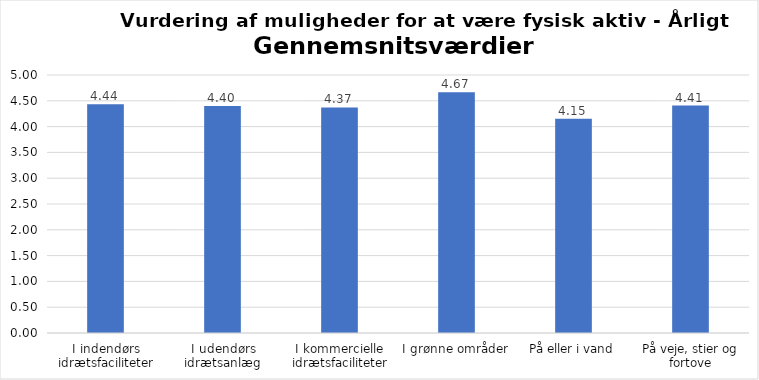
| Category | Gennemsnit |
|---|---|
| I indendørs idrætsfaciliteter | 4.435 |
| I udendørs idrætsanlæg | 4.397 |
| I kommercielle idrætsfaciliteter | 4.371 |
| I grønne områder | 4.667 |
| På eller i vand | 4.154 |
| På veje, stier og fortove | 4.407 |